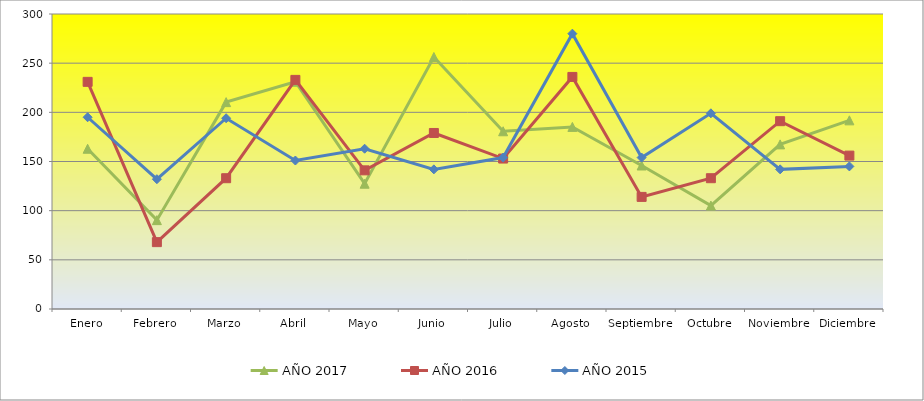
| Category | AÑO 2017 | AÑO 2016 | AÑO 2015 |
|---|---|---|---|
| Enero | 162.963 | 231 | 195 |
| Febrero | 90.37 | 68 | 132 |
| Marzo | 210.37 | 133 | 194 |
| Abril | 231.111 | 233 | 151 |
| Mayo | 127.407 | 141 | 163 |
| Junio | 256.296 | 179 | 142 |
| Julio | 180.741 | 153 | 154 |
| Agosto | 185.185 | 236 | 280 |
| Septiembre | 145.926 | 114 | 154 |
| Octubre | 105.185 | 133 | 199 |
| Noviembre | 167.407 | 191 | 142 |
| Diciembre | 191.852 | 156 | 145 |